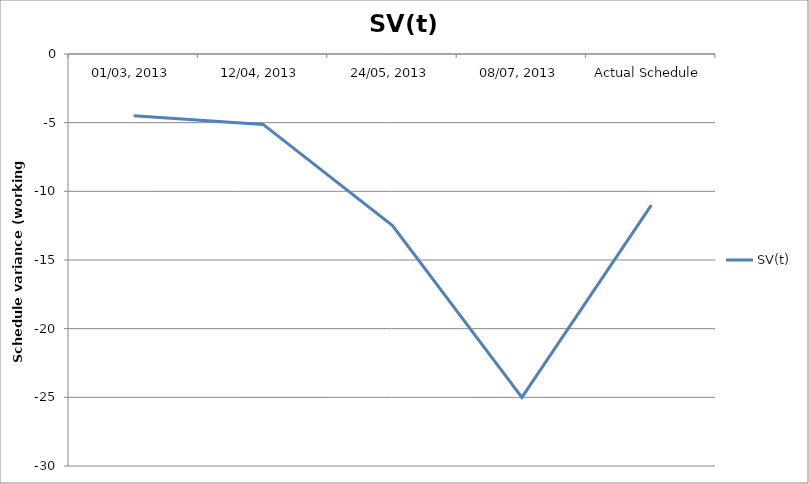
| Category | SV(t) |
|---|---|
| 01/03, 2013 | -4.5 |
| 12/04, 2013 | -5.125 |
| 24/05, 2013 | -12.5 |
| 08/07, 2013 | -25 |
| Actual Schedule | -11 |